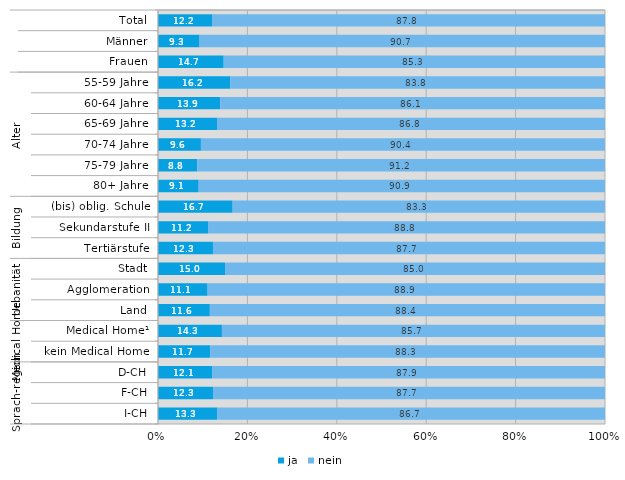
| Category | ja | nein |
|---|---|---|
| 0 | 12.2 | 87.8 |
| 1 | 9.3 | 90.7 |
| 2 | 14.7 | 85.3 |
| 3 | 16.2 | 83.8 |
| 4 | 13.9 | 86.1 |
| 5 | 13.2 | 86.8 |
| 6 | 9.6 | 90.4 |
| 7 | 8.8 | 91.2 |
| 8 | 9.1 | 90.9 |
| 9 | 16.7 | 83.3 |
| 10 | 11.2 | 88.8 |
| 11 | 12.3 | 87.7 |
| 12 | 15 | 85 |
| 13 | 11.1 | 88.9 |
| 14 | 11.6 | 88.4 |
| 15 | 14.3 | 85.7 |
| 16 | 11.7 | 88.3 |
| 17 | 12.1 | 87.9 |
| 18 | 12.3 | 87.7 |
| 19 | 13.3 | 86.7 |